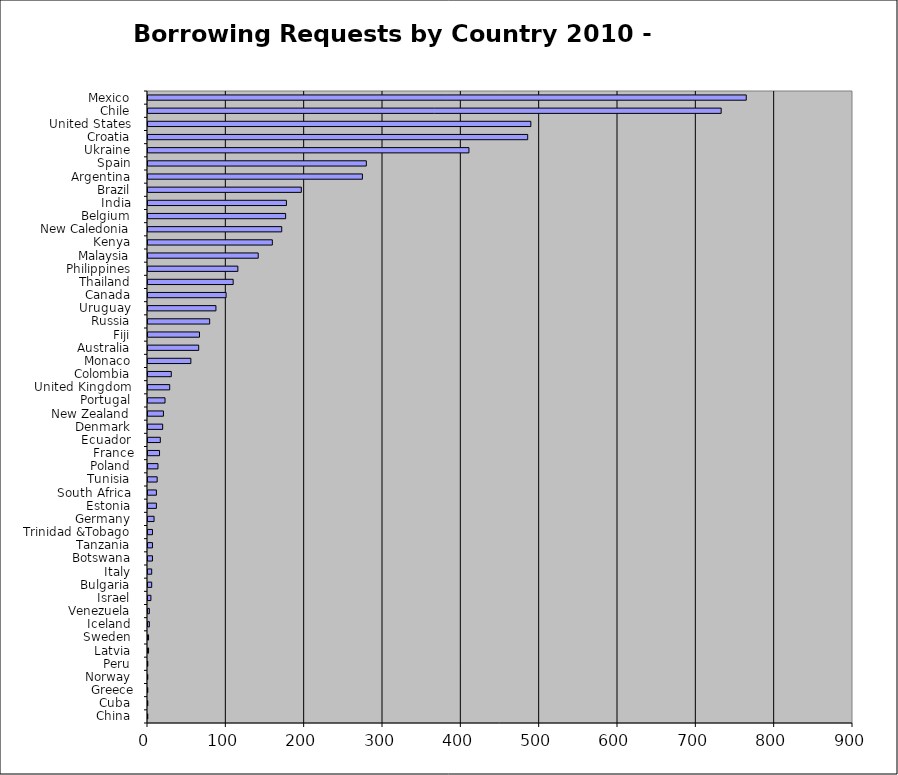
| Category | Series 0 |
|---|---|
| China  | 1 |
| Cuba  | 1 |
| Greece | 1 |
| Norway  | 1 |
| Peru  | 1 |
| Latvia  | 2 |
| Sweden  | 2 |
| Iceland  | 3 |
| Venezuela  | 3 |
| Israel  | 5 |
| Bulgaria  | 6 |
| Italy  | 6 |
| Botswana  | 7 |
| Tanzania  | 7 |
| Trinidad &Tobago  | 7 |
| Germany  | 9 |
| Estonia  | 12 |
| South Africa  | 12 |
| Tunisia  | 13 |
| Poland  | 14 |
| France | 16 |
| Ecuador  | 17 |
| Denmark  | 20 |
| New Zealand  | 21 |
| Portugal  | 23 |
| United Kingdom  | 29 |
| Colombia  | 31 |
| Monaco  | 56 |
| Australia  | 66 |
| Fiji  | 67 |
| Russia  | 80 |
| Uruguay  | 88 |
| Canada  | 101 |
| Thailand  | 110 |
| Philippines  | 116 |
| Malaysia  | 142 |
| Kenya  | 160 |
| New Caledonia  | 172 |
| Belgium  | 177 |
| India  | 178 |
| Brazil  | 197 |
| Argentina  | 275 |
| Spain  | 280 |
| Ukraine  | 411 |
| Croatia  | 486 |
| United States  | 490 |
| Chile  | 733 |
| Mexico  | 765 |